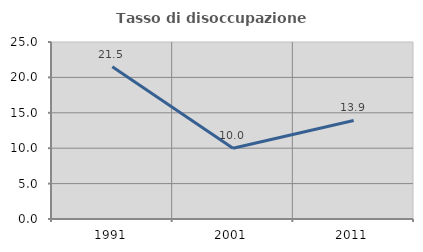
| Category | Tasso di disoccupazione giovanile  |
|---|---|
| 1991.0 | 21.488 |
| 2001.0 | 10 |
| 2011.0 | 13.913 |